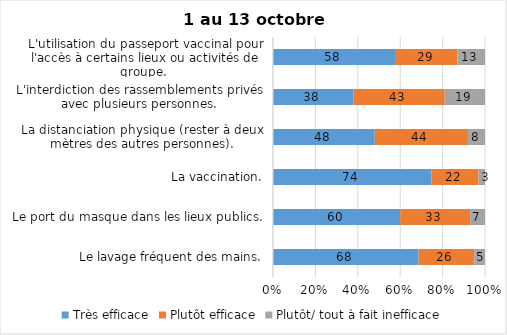
| Category | Très efficace | Plutôt efficace | Plutôt/ tout à fait inefficace |
|---|---|---|---|
| Le lavage fréquent des mains. | 68 | 26 | 5 |
| Le port du masque dans les lieux publics. | 60 | 33 | 7 |
| La vaccination. | 74 | 22 | 3 |
| La distanciation physique (rester à deux mètres des autres personnes). | 48 | 44 | 8 |
| L'interdiction des rassemblements privés avec plusieurs personnes. | 38 | 43 | 19 |
| L'utilisation du passeport vaccinal pour l'accès à certains lieux ou activités de groupe.  | 58 | 29 | 13 |